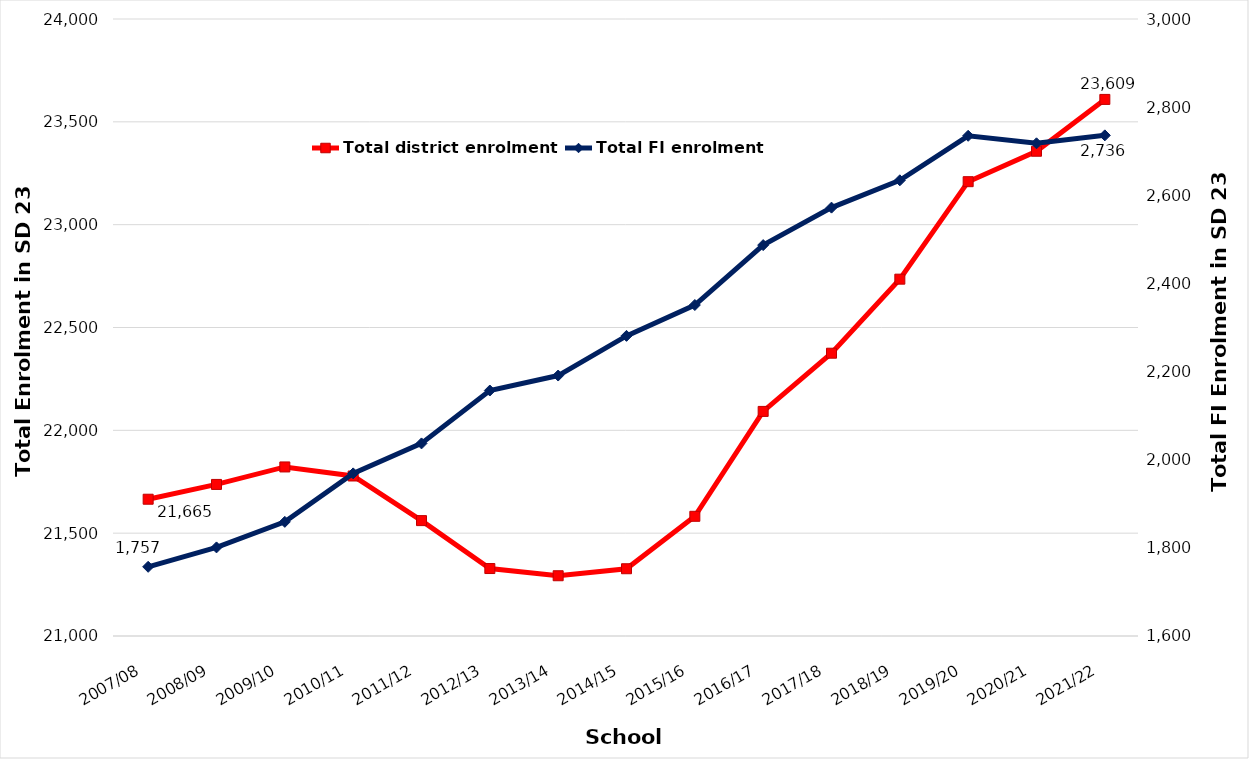
| Category | Total district enrolment  |
|---|---|
| 2007/08 | 21665 |
| 2008/09 | 21737 |
| 2009/10 | 21822 |
| 2010/11 | 21778 |
| 2011/12 | 21561 |
| 2012/13 | 21328 |
| 2013/14 | 21293 |
| 2014/15 | 21327 |
| 2015/16 | 21582 |
| 2016/17 | 22092 |
| 2017/18 | 22375 |
| 2018/19 | 22735 |
| 2019/20 | 23209 |
| 2020/21 | 23357 |
| 2021/22 | 23609 |